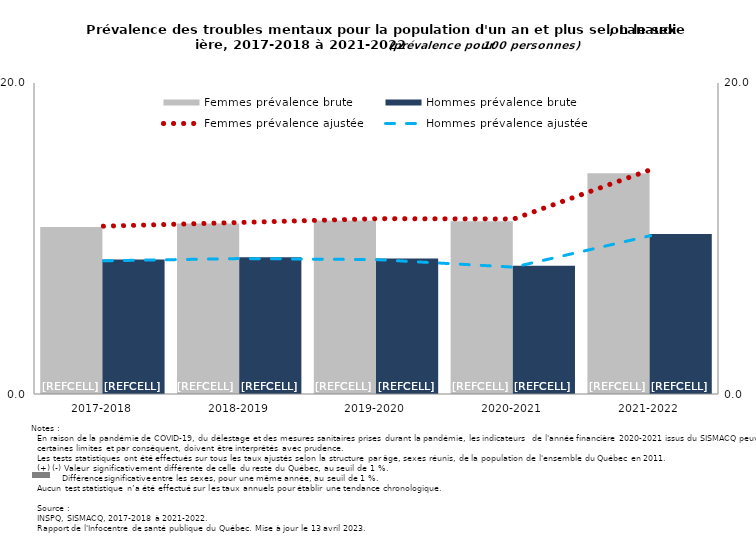
| Category | Femmes prévalence brute | Hommes prévalence brute |
|---|---|---|
| 2017-2018 | 10.741 | 8.655 |
| 2018-2019 | 10.96 | 8.797 |
| 2019-2020 | 11.155 | 8.719 |
| 2020-2021 | 11.114 | 8.249 |
| 2021-2022 | 14.198 | 10.288 |